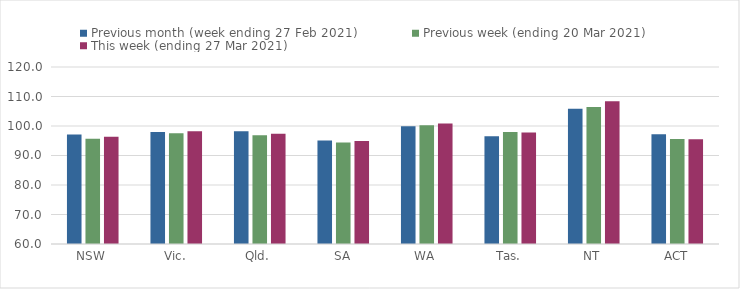
| Category | Previous month (week ending 27 Feb 2021) | Previous week (ending 20 Mar 2021) | This week (ending 27 Mar 2021) |
|---|---|---|---|
| NSW | 97.09 | 95.72 | 96.32 |
| Vic. | 97.96 | 97.53 | 98.2 |
| Qld. | 98.24 | 96.85 | 97.38 |
| SA | 95.08 | 94.42 | 94.92 |
| WA | 99.95 | 100.29 | 100.86 |
| Tas. | 96.52 | 97.94 | 97.78 |
| NT | 105.87 | 106.46 | 108.42 |
| ACT | 97.24 | 95.56 | 95.52 |